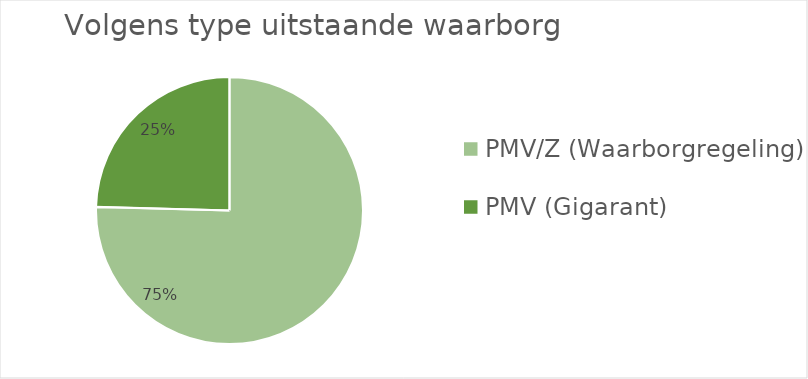
| Category | Series 0 |
|---|---|
| PMV/Z (Waarborgregeling) | 640.726 |
| PMV (Gigarant) | 208.692 |